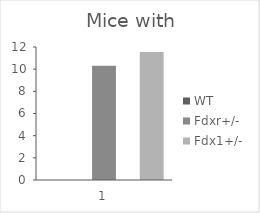
| Category | WT | Fdxr+/- | Fdx1+/- |
|---|---|---|---|
| 0 | 0 | 10.3 | 11.54 |